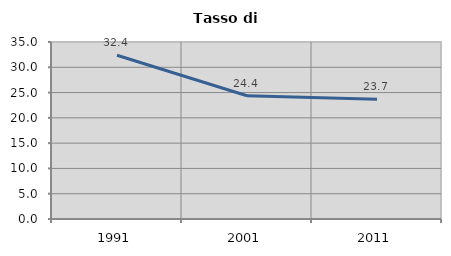
| Category | Tasso di disoccupazione   |
|---|---|
| 1991.0 | 32.384 |
| 2001.0 | 24.38 |
| 2011.0 | 23.67 |